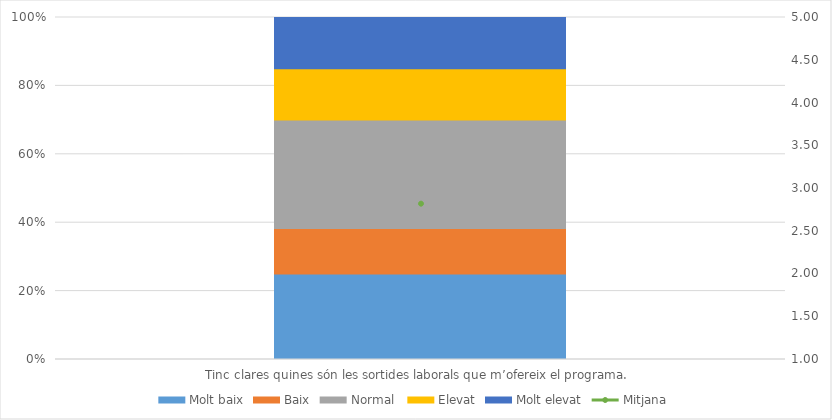
| Category | Molt baix | Baix | Normal  | Elevat | Molt elevat |
|---|---|---|---|---|---|
| Tinc clares quines són les sortides laborals que m’ofereix el programa. | 15 | 8 | 19 | 9 | 9 |